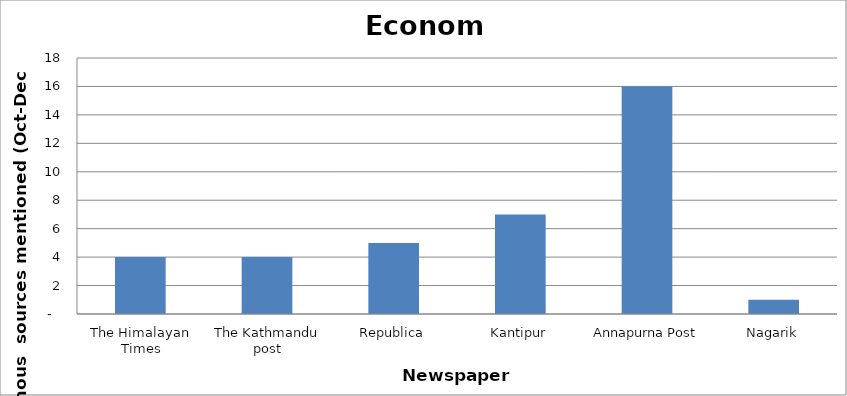
| Category | Economy |
|---|---|
| The Himalayan Times | 4 |
| The Kathmandu post | 4 |
| Republica | 5 |
| Kantipur | 7 |
| Annapurna Post | 16 |
| Nagarik | 1 |